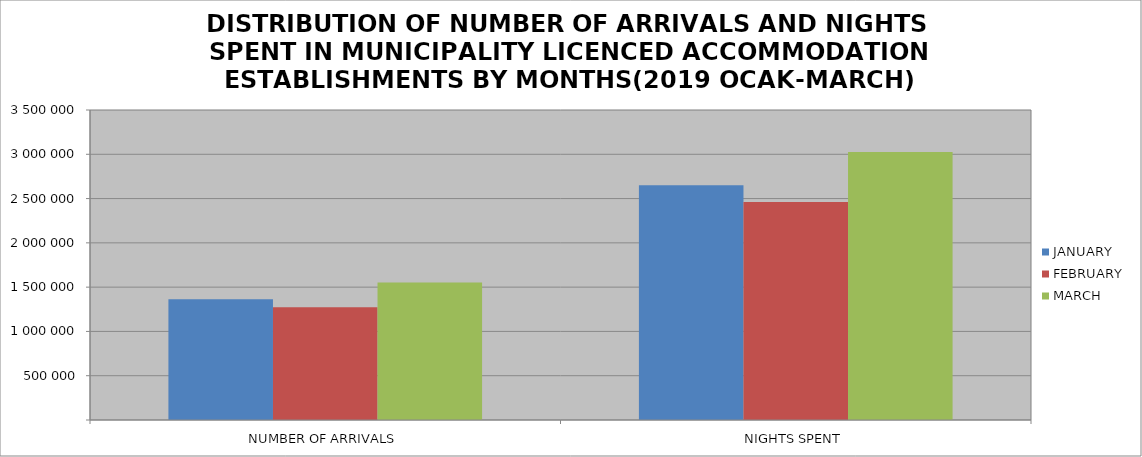
| Category | JANUARY | FEBRUARY | MARCH |
|---|---|---|---|
| NUMBER OF ARRIVALS | 1363187 | 1273727 | 1552518 |
| NIGHTS SPENT | 2649437 | 2462023 | 3024704 |